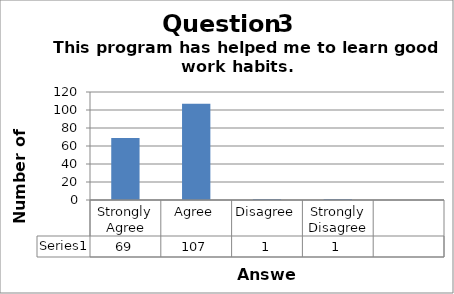
| Category | Series 0 |
|---|---|
| Strongly Agree | 69 |
| Agree | 107 |
| Disagree | 1 |
| Strongly Disagree | 1 |